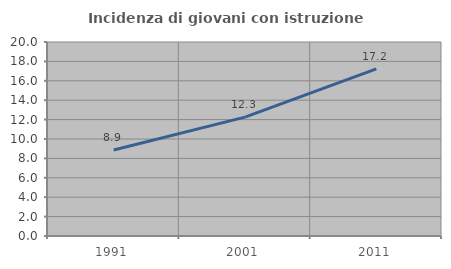
| Category | Incidenza di giovani con istruzione universitaria |
|---|---|
| 1991.0 | 8.867 |
| 2001.0 | 12.254 |
| 2011.0 | 17.231 |